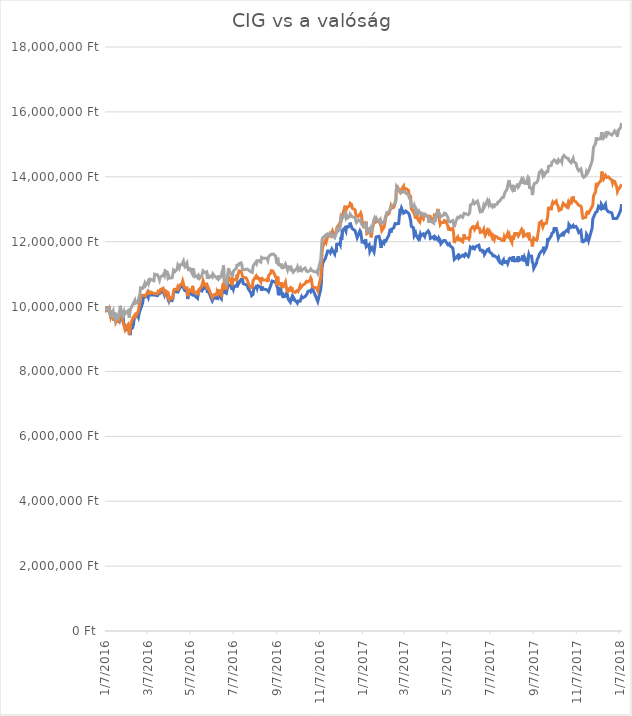
| Category | Series 0 | Valódi | USDHUF nélkül |
|---|---|---|---|
| 1/7/16 | 10000000 | 10000000 | 10000000 |
| 1/8/16 | 9874837.663 | 9873043.613 | 9911183.194 |
| 1/11/16 | 9892191.39 | 9892722.848 | 9913500.154 |
| 1/12/16 | 10006181.556 | 10009686.042 | 9947482.237 |
| 1/13/16 | 9769637.783 | 9768966.315 | 9750540.624 |
| 1/14/16 | 9850338.284 | 9852021.037 | 9891102.873 |
| 1/15/16 | 9673398.325 | 9672088.483 | 9742045.103 |
| 1/18/16 | 9693474.205 | 9822749.404 | 9867160.951 |
| 1/19/16 | 9818352.984 | 9561372.497 | 9640871.177 |
| 1/20/16 | 9561506.485 | 9627882.8 | 9701884.461 |
| 1/21/16 | 9626214.336 | 9735030.193 | 9811553.908 |
| 1/22/16 | 9731697.773 | 9513684.858 | 9586808.774 |
| 1/25/16 | 9510295.977 | 9636884.382 | 9722737.102 |
| 1/26/16 | 9631545.219 | 9591272.149 | 9668674.699 |
| 1/27/16 | 9585892.441 | 9601932.793 | 9732004.943 |
| 1/28/16 | 9595760.246 | 9867094.029 | 10022397.281 |
| 1/29/16 | 9857994.34 | 9776549.566 | 9936669.756 |
| 2/1/16 | 9766121.669 | 9516937.094 | 9708063.021 |
| 2/2/16 | 9507573.824 | 9540402.037 | 9749768.304 |
| 2/3/16 | 9530315.146 | 9382196.926 | 9842446.71 |
| 2/4/16 | 9372033.278 | 9289536.564 | 9774482.546 |
| 2/5/16 | 9279309.934 | 9336635.164 | 9791473.587 |
| 2/8/16 | 9324282.174 | 9434668.517 | 9864071.671 |
| 2/9/16 | 9421088.748 | 9277233.151 | 9776027.186 |
| 2/10/16 | 9263827.688 | 9139814.448 | 9660951.498 |
| 2/11/16 | 9117908.933 | 9313711.23 | 9891102.873 |
| 2/12/16 | 9295472.719 | 9469427.881 | 9928946.555 |
| 2/15/16 | 9355530.224 | 9637506.908 | 10060240.964 |
| 2/16/16 | 9455229.086 | 9660022.459 | 10106580.167 |
| 2/17/16 | 9623265.336 | 9709518.634 | 10121254.248 |
| 2/18/16 | 9643114.37 | 9743438.517 | 10193852.332 |
| 2/19/16 | 9692850.378 | 9689673.021 | 10097312.326 |
| 2/22/16 | 9724268.563 | 9814084.294 | 10119709.608 |
| 2/23/16 | 9670846.306 | 9883272.601 | 10218566.574 |
| 2/24/16 | 9792379.105 | 9865342.304 | 10188446.092 |
| 2/25/16 | 9859638.974 | 10136139.818 | 10362218.103 |
| 2/26/16 | 9841377.863 | 10342861.329 | 10576150.757 |
| 2/29/16 | 10105086.457 | 10339699.129 | 10559932.036 |
| 3/1/16 | 10306582.507 | 10323325.732 | 10568427.556 |
| 3/2/16 | 10302839.546 | 10347067.017 | 10655699.722 |
| 3/3/16 | 10286166.358 | 10376073.719 | 10713623.726 |
| 3/4/16 | 10308680.833 | 10322616.699 | 10642570.281 |
| 3/7/16 | 10334427.866 | 10449567.275 | 10745288.848 |
| 3/8/16 | 10282877.089 | 10400963.52 | 10705900.525 |
| 3/9/16 | 10403048.812 | 10431607.895 | 10862681.495 |
| 3/10/16 | 10354617.169 | 10398966.553 | 10790855.731 |
| 3/11/16 | 10383766.893 | 10449577.04 | 10843373.494 |
| 3/16/16 | 10356545.361 | 10407153.544 | 10799351.251 |
| 3/17/16 | 10342310.768 | 10393249.289 | 10997837.504 |
| 3/18/16 | 10349172.862 | 10401007.038 | 10979301.823 |
| 3/21/16 | 10336979.884 | 10390514.79 | 10976984.863 |
| 3/22/16 | 10412122.656 | 10468872.278 | 10980846.463 |
| 3/23/16 | 10402368.273 | 10459462.312 | 10886623.417 |
| 3/24/16 | 10391025.968 | 10448441.66 | 10820976.213 |
| 3/25/16 | 10378492.721 | 10519191.536 | 10912109.978 |
| 3/29/16 | 10499571.828 | 10564606.688 | 10959221.501 |
| 3/30/16 | 10408663.253 | 10470965.675 | 11002471.424 |
| 3/31/16 | 10352405.419 | 10414404.994 | 10957676.861 |
| 4/1/16 | 10428568.998 | 10493937.135 | 11105189.991 |
| 4/4/16 | 10384447.431 | 10450437.751 | 11061167.748 |
| 4/5/16 | 10251855.885 | 10313908.761 | 10905159.098 |
| 4/6/16 | 10287243.877 | 10351183.121 | 10943775.1 |
| 4/7/16 | 10172062.768 | 10232736.902 | 10875038.616 |
| 4/8/16 | 10216751.45 | 10279726.547 | 10894346.617 |
| 4/11/16 | 10185219.842 | 10249184.732 | 10888940.377 |
| 4/12/16 | 10242328.348 | 10308984.806 | 10997837.504 |
| 4/13/16 | 10417680.385 | 10491542.532 | 11124497.992 |
| 4/14/16 | 10455563.684 | 10531541.944 | 11099783.75 |
| 4/15/16 | 10443540.841 | 10519750.563 | 11078931.109 |
| 4/18/16 | 10450346.224 | 10528950.366 | 11150756.874 |
| 4/19/16 | 10523560.803 | 10605876.123 | 11272011.121 |
| 4/20/16 | 10485167.101 | 10567204.555 | 11282823.602 |
| 4/21/16 | 10461064.702 | 10543197.143 | 11187828.236 |
| 4/22/16 | 10582654.213 | 10668681.014 | 11284368.242 |
| 4/25/16 | 10617191.532 | 10706375.726 | 11289774.483 |
| 4/26/16 | 10692504.438 | 10784673.668 | 11354649.367 |
| 4/27/16 | 10700444.051 | 10793536.362 | 11399443.93 |
| 4/28/16 | 10529175.244 | 10617697.118 | 11281278.962 |
| 4/29/16 | 10490894.965 | 10579443.035 | 11235712.079 |
| 5/2/16 | 10488456.369 | 10579077.082 | 11344609.206 |
| 5/3/16 | 10232290.408 | 10319647.785 | 11185511.276 |
| 5/4/16 | 10331875.847 | 10421522.279 | 11139944.393 |
| 5/5/16 | 10345429.902 | 10435982.085 | 11112140.871 |
| 5/6/16 | 10421706.903 | 10514216.713 | 11169292.555 |
| 5/9/16 | 10373445.395 | 10467256.735 | 11037225.826 |
| 5/10/16 | 10542332.318 | 10639183.112 | 11181649.676 |
| 5/11/16 | 10391706.507 | 10487073.875 | 11034136.546 |
| 5/12/16 | 10415695.482 | 10512145.791 | 11068118.628 |
| 5/13/16 | 10332896.655 | 10428699.854 | 10920605.499 |
| 5/17/16 | 10254634.749 | 10463394.418 | 10955359.901 |
| 5/18/16 | 10418417.635 | 10352011.086 | 10838739.574 |
| 5/19/16 | 10418304.212 | 10519078.335 | 10926011.739 |
| 5/20/16 | 10512615.479 | 10519699.137 | 10873493.976 |
| 5/23/16 | 10482558.37 | 10616224.734 | 10953815.261 |
| 5/24/16 | 10687910.804 | 10587774.061 | 10926784.059 |
| 5/25/16 | 10683714.151 | 10797368.481 | 11099011.43 |
| 5/26/16 | 10553277.643 | 10793817.003 | 11127587.272 |
| 5/27/16 | 10578570.983 | 10661233.599 | 11048038.307 |
| 5/30/16 | 10621444.896 | 10687776.279 | 11071207.909 |
| 5/31/16 | 10418474.347 | 10524141.151 | 10854185.975 |
| 6/1/16 | 10488342.946 | 10597305.082 | 10966172.382 |
| 6/2/16 | 10439174.053 | 10547056.78 | 10975440.222 |
| 6/3/16 | 10393294.429 | 10500158.869 | 10900525.178 |
| 6/6/16 | 10225938.718 | 10328713.848 | 10953042.941 |
| 6/7/16 | 10176316.133 | 10277840.181 | 10921377.819 |
| 6/8/16 | 10225598.448 | 10329742.476 | 11007877.665 |
| 6/9/16 | 10245390.771 | 10351025.712 | 10984708.063 |
| 6/10/16 | 10266147.189 | 10373246.08 | 10948409.021 |
| 6/13/16 | 10253160.25 | 10361861.968 | 10885078.777 |
| 6/14/16 | 10358246.706 | 10470817.766 | 10912882.298 |
| 6/15/16 | 10311743.256 | 10423482.945 | 10847235.094 |
| 6/16/16 | 10419041.462 | 10535136.436 | 10966172.382 |
| 6/17/16 | 10319682.869 | 10433433.468 | 10868860.056 |
| 6/20/16 | 10237507.869 | 10350871.274 | 10941458.14 |
| 6/21/16 | 10405941.099 | 10525236.41 | 11085109.669 |
| 6/22/16 | 10538475.934 | 10662631.338 | 11116774.791 |
| 6/23/16 | 10607777.419 | 10734725.298 | 11274328.082 |
| 6/24/16 | 10447056.955 | 10569870.061 | 10790083.411 |
| 6/27/16 | 10407982.714 | 10553300.379 | 10696632.685 |
| 6/28/16 | 10507965.134 | 10682975.37 | 10834105.653 |
| 6/29/16 | 10601992.843 | 10807260.705 | 10976212.542 |
| 6/30/16 | 10675944.672 | 10922696.269 | 11182421.996 |
| 7/1/16 | 10641861.045 | 10882620.992 | 11118319.432 |
| 7/4/16 | 10647872.467 | 10746558.234 | 10984708.063 |
| 7/5/16 | 10518967.17 | 10831623.323 | 11006333.024 |
| 7/6/16 | 10605508.958 | 10754764.595 | 10959993.821 |
| 7/7/16 | 10534335.993 | 10839746.204 | 11094377.51 |
| 7/8/16 | 10617134.82 | 10867749.539 | 11116002.471 |
| 7/11/16 | 10647135.217 | 10823813.139 | 11173154.155 |
| 7/12/16 | 10592181.749 | 10986236.198 | 11270466.481 |
| 7/13/16 | 10740198.831 | 10918974.3 | 11255020.08 |
| 7/14/16 | 10685812.478 | 10943154.007 | 11273555.762 |
| 7/15/16 | 10697721.898 | 11093147.025 | 11319894.964 |
| 7/18/16 | 10839160.443 | 11091176.86 | 11346926.166 |
| 7/19/16 | 10832071.502 | 11088472.559 | 11289002.162 |
| 7/20/16 | 10839160.443 | 10938532.85 | 11148439.914 |
| 7/21/16 | 10707589.703 | 10912583.772 | 11167747.915 |
| 7/22/16 | 10690973.226 | 10890873.26 | 11132221.192 |
| 7/25/16 | 10671124.193 | 10886834.004 | 11147667.593 |
| 7/26/16 | 10651161.736 | 10905364.431 | 11136082.793 |
| 7/27/16 | 10648836.563 | 10801659.773 | 11153846.154 |
| 7/28/16 | 10551179.316 | 10775510.404 | 11142261.353 |
| 7/29/16 | 10525488.995 | 10671820.686 | 11116002.471 |
| 8/1/16 | 10420799.519 | 10582878.313 | 11068118.628 |
| 8/2/16 | 10336242.635 | 10590120.396 | 11092832.87 |
| 8/3/16 | 10345543.325 | 10608344.496 | 11053444.547 |
| 8/4/16 | 10373785.664 | 10793167.782 | 11248841.52 |
| 8/5/16 | 10551009.182 | 10832076.313 | 11241890.639 |
| 8/8/16 | 10589176.038 | 10932949.67 | 11370095.768 |
| 8/9/16 | 10664262.098 | 10838316.755 | 11329162.805 |
| 8/10/16 | 10571708.888 | 10915504.87 | 11410256.41 |
| 8/11/16 | 10639876.142 | 10899131.791 | 11408711.77 |
| 8/12/16 | 10622352.281 | 10871795.084 | 11413345.69 |
| 8/15/16 | 10595811.287 | 10756661.469 | 11371640.408 |
| 8/16/16 | 10485564.081 | 10908489.322 | 11513747.297 |
| 8/17/16 | 10612938.167 | 10824367.92 | 11492894.656 |
| 8/18/16 | 10539950.434 | 10831450.364 | 11488260.735 |
| 8/19/16 | 10543239.703 | 10817089.934 | 11465091.134 |
| 8/22/16 | 10527757.456 | 10820668.797 | 11489805.375 |
| 8/23/16 | 10524751.745 | 10802754.607 | 11462001.854 |
| 8/24/16 | 10509609.768 | 10825412.681 | 11479765.215 |
| 8/25/16 | 10523560.803 | 10756154.93 | 11423385.851 |
| 8/26/16 | 10458739.53 | 10953111.934 | 11530738.338 |
| 8/29/16 | 10644923.468 | 11027717.944 | 11602564.103 |
| 8/30/16 | 10706398.761 | 11105505.632 | 11622644.424 |
| 8/31/16 | 10786078.455 | 11097169.06 | 11611831.943 |
| 9/1/16 | 10775530.111 | 11096882.13 | 11640407.785 |
| 9/2/16 | 10775643.534 | 11078724.051 | 11618010.504 |
| 9/5/16 | 10749499.521 | 10924038.575 | 11552363.299 |
| 9/6/16 | 10759934.441 | 10877437.412 | 11567809.7 |
| 9/7/16 | 10622352.281 | 10656119.861 | 11323756.565 |
| 9/8/16 | 10570177.677 | 10922181.982 | 11505251.776 |
| 9/9/16 | 10349683.266 | 10707321.562 | 11293636.083 |
| 9/12/16 | 10599327.401 | 10675531.961 | 11258881.681 |
| 9/13/16 | 10399022.293 | 10748147.347 | 11326845.845 |
| 9/14/16 | 10359891.341 | 10606446.348 | 11199413.037 |
| 9/15/16 | 10430894.171 | 10623269.206 | 11217176.398 |
| 9/16/16 | 10305051.296 | 10611784.683 | 11192462.156 |
| 9/19/16 | 10314408.697 | 10757197.224 | 11311399.444 |
| 9/20/16 | 10311573.121 | 10632470.415 | 11316805.684 |
| 9/21/16 | 10433729.747 | 10517988.065 | 11198640.717 |
| 9/22/16 | 10323822.811 | 10434021.206 | 11135310.473 |
| 9/23/16 | 10226449.121 | 10526838.5 | 11224899.598 |
| 9/26/16 | 10136447.93 | 10578777.202 | 11220265.678 |
| 9/27/16 | 10226902.813 | 10462575.82 | 11089743.59 |
| 9/28/16 | 10279417.686 | 10594167.799 | 11157707.754 |
| 9/29/16 | 10169794.307 | 10472292.405 | 11102873.031 |
| 9/30/16 | 10296714.701 | 10468064.374 | 11057306.148 |
| 10/3/16 | 10176996.671 | 10437205.325 | 11132993.513 |
| 10/4/16 | 10170758.403 | 10408914.741 | 11111368.551 |
| 10/5/16 | 10140814.718 | 10486237.843 | 11161569.354 |
| 10/6/16 | 10106844.514 | 10485104.028 | 11214087.118 |
| 10/7/16 | 10168149.673 | 10460158.396 | 11117547.112 |
| 10/10/16 | 10166788.596 | 10645275.431 | 11191689.836 |
| 10/11/16 | 10139793.91 | 10588773.606 | 11061167.748 |
| 10/12/16 | 10301365.046 | 10604274.192 | 11135310.473 |
| 10/13/16 | 10261156.575 | 10646155.247 | 11105962.311 |
| 10/14/16 | 10269379.746 | 10660197.912 | 11144578.313 |
| 10/17/16 | 10310155.333 | 10710793.54 | 11187828.236 |
| 10/18/16 | 10320873.811 | 10730212.592 | 11159252.394 |
| 10/19/16 | 10366186.32 | 10780720.705 | 11090515.91 |
| 10/20/16 | 10404466.6 | 10797606.214 | 11108279.271 |
| 10/21/16 | 10466112.028 | 10760737.504 | 11076614.149 |
| 10/24/16 | 10491575.503 | 10810447.584 | 11116774.791 |
| 10/25/16 | 10459136.51 | 10878648.526 | 11156163.114 |
| 10/26/16 | 10503144.654 | 10833295.255 | 11121408.712 |
| 10/27/16 | 10560480.006 | 10654454.271 | 11144578.313 |
| 10/28/16 | 10521802.746 | 10604984.525 | 11092832.87 |
| 11/2/16 | 10265012.959 | 10572496.931 | 11058850.788 |
| 11/3/16 | 10259908.921 | 10581709.922 | 11093605.19 |
| 11/4/16 | 10155616.426 | 10484980.239 | 11040315.107 |
| 11/7/16 | 10429022.69 | 10789469.163 | 11346153.846 |
| 11/8/16 | 10507398.018 | 10866256.033 | 11414118.011 |
| 11/9/16 | 10689555.438 | 11093553.711 | 11683657.708 |
| 11/10/16 | 11171773.54 | 11651134.821 | 12052826.691 |
| 11/11/16 | 11341227.578 | 11839427.165 | 12119246.216 |
| 11/15/16 | 11494518.831 | 12050992.494 | 12197250.541 |
| 11/16/16 | 11574141.813 | 11992565.879 | 12160951.498 |
| 11/17/16 | 11625465.743 | 12079917.413 | 12131603.336 |
| 11/18/16 | 11710816.589 | 12143674.058 | 12232777.263 |
| 11/21/16 | 11706960.206 | 12247394.558 | 12183348.78 |
| 11/22/16 | 11662044.677 | 12246962.823 | 12257491.504 |
| 11/23/16 | 11670948.387 | 12186267.568 | 12253629.904 |
| 11/24/16 | 11771668.056 | 12214508.743 | 12211152.302 |
| 11/25/16 | 11732253.546 | 12328629.359 | 12216558.542 |
| 11/28/16 | 11616959.015 | 12172258.365 | 12123107.816 |
| 11/29/16 | 11747168.677 | 12192587.033 | 12177942.539 |
| 11/30/16 | 11676506.116 | 12267193.389 | 12159406.858 |
| 12/1/16 | 11920138.83 | 12422473.954 | 12366388.631 |
| 12/2/16 | 11895015.624 | 12457196.46 | 12310009.268 |
| 12/5/16 | 11938910.345 | 12550617.731 | 12373339.512 |
| 12/6/16 | 11896036.431 | 12627152.751 | 12460611.677 |
| 12/7/16 | 12147268.489 | 12754300.142 | 12719338.894 |
| 12/8/16 | 12051652.857 | 12703285.782 | 12674544.331 |
| 12/9/16 | 12339010.157 | 12699220.866 | 12732468.335 |
| 12/12/16 | 12414776.755 | 13042691.984 | 12829780.661 |
| 12/13/16 | 12435873.443 | 13108919.178 | 12868396.664 |
| 12/14/16 | 12322733.949 | 12963847.461 | 12747914.736 |
| 12/15/16 | 12494796.718 | 13016029.628 | 12799660.179 |
| 12/16/16 | 12438822.442 | 13061390.17 | 12724745.134 |
| 12/19/16 | 12471488.281 | 13100703.529 | 12770312.017 |
| 12/20/16 | 12584060.659 | 13183816.099 | 12848316.342 |
| 12/21/16 | 12507556.811 | 13198002.189 | 12816651.22 |
| 12/22/16 | 12454247.977 | 13150174.31 | 12822829.781 |
| 12/23/16 | 12401165.989 | 13029452.712 | 12767995.057 |
| 12/27/16 | 12340541.368 | 12982345.78 | 12739419.215 |
| 12/28/16 | 12264718.059 | 12847924.145 | 12646740.809 |
| 12/29/16 | 12202732.361 | 12804250.979 | 12592678.406 |
| 12/30/16 | 12121408.034 | 12778427.441 | 12587272.166 |
| 12/31/16 | 12120614.072 | 12767689.022 | 12652919.37 |
| 1/3/17 | 12336344.715 | 12846821.536 | 12672227.371 |
| 1/4/17 | 12295625.84 | 12886282.487 | 12611986.407 |
| 1/5/17 | 12154357.43 | 12829486.301 | 12620481.928 |
| 1/6/17 | 11988929.91 | 12637379.378 | 12513129.441 |
| 1/9/17 | 12007134.31 | 12414950.593 | 12470651.838 |
| 1/10/17 | 11919571.715 | 12600378.653 | 12529348.162 |
| 1/11/17 | 12069460.276 | 12476297.403 | 12466017.918 |
| 1/12/17 | 11843238.001 | 12612553.474 | 12503861.6 |
| 1/13/17 | 11855827.96 | 12249677.632 | 12329317.269 |
| 1/16/17 | 11913673.716 | 12295736.618 | 12394964.473 |
| 1/17/17 | 11696468.573 | 12276444.512 | 12311553.908 |
| 1/18/17 | 11743652.563 | 12251327.884 | 12373339.512 |
| 1/19/17 | 11720684.395 | 12132891.138 | 12265214.705 |
| 1/20/17 | 11814938.95 | 12324872.76 | 12412727.834 |
| 1/23/17 | 11678547.731 | 12627824.872 | 12685356.812 |
| 1/24/17 | 11818341.642 | 12633384.913 | 12737102.255 |
| 1/25/17 | 12038722.63 | 12600094.987 | 12696941.613 |
| 1/26/17 | 12145226.874 | 12618070.235 | 12727834.415 |
| 1/27/17 | 12171654.445 | 12620674.55 | 12676861.291 |
| 1/30/17 | 12164792.351 | 12658504.115 | 12635928.329 |
| 1/31/17 | 12095887.847 | 12592709.585 | 12588816.806 |
| 2/1/17 | 11953258.361 | 12634878.34 | 12661414.89 |
| 2/2/17 | 11810515.451 | 12486390.476 | 12621254.248 |
| 2/3/17 | 11996585.966 | 12336541.387 | 12583410.565 |
| 2/6/17 | 11940838.537 | 12439180.532 | 12578776.645 |
| 2/7/17 | 12035206.515 | 12521574.517 | 12669138.091 |
| 2/8/17 | 12025962.536 | 12645495.783 | 12666821.131 |
| 2/9/17 | 12021822.595 | 12787363.427 | 12808928.02 |
| 2/10/17 | 12076265.659 | 12780471.986 | 12893883.225 |
| 2/13/17 | 12196891.074 | 12863883.746 | 12919369.787 |
| 2/14/17 | 12295285.571 | 12907269.85 | 12954896.509 |
| 2/15/17 | 12397479.74 | 12993055.01 | 13018999.073 |
| 2/16/17 | 12286438.573 | 13094440.214 | 13046030.275 |
| 2/17/17 | 12386420.992 | 13031809.688 | 13099320.358 |
| 2/20/17 | 12423170.061 | 13059754.91 | 13141025.641 |
| 2/21/17 | 12504834.658 | 13106683.178 | 13146431.881 |
| 2/22/17 | 12559107.587 | 13212508.114 | 13178097.003 |
| 2/23/17 | 12573512.315 | 13297789.044 | 13239110.287 |
| 2/24/17 | 12547198.167 | 13735909.69 | 13691689.836 |
| 2/27/17 | 12560525.376 | 13595072.266 | 13584337.349 |
| 2/28/17 | 12581281.794 | 13563923.024 | 13568118.628 |
| 3/1/17 | 13011155.157 | 13524152.774 | 13546493.667 |
| 3/2/17 | 12944348.98 | 13579240.249 | 13538770.466 |
| 3/3/17 | 13034860.575 | 13593606.809 | 13513283.905 |
| 3/6/17 | 12876351.861 | 13710774.036 | 13544176.707 |
| 3/7/17 | 12888658.262 | 13560488.303 | 13514056.225 |
| 3/8/17 | 12906238.835 | 13638337.686 | 13545721.347 |
| 3/9/17 | 12942023.807 | 13617153.774 | 13494748.224 |
| 3/10/17 | 12914802.275 | 13630554.25 | 13490114.303 |
| 3/13/17 | 12878847.168 | 13575274.337 | 13444547.42 |
| 3/14/17 | 12834668.89 | 13431156.895 | 13347235.094 |
| 3/16/17 | 12660904.776 | 13397981.63 | 13289311.091 |
| 3/17/17 | 12473416.472 | 13014757.138 | 13088507.878 |
| 3/20/17 | 12427877.117 | 12906460.99 | 13075378.437 |
| 3/21/17 | 12189178.307 | 12941972.109 | 13120945.32 |
| 3/22/17 | 12202959.207 | 12798594.428 | 13025949.954 |
| 3/23/17 | 12274982.845 | 12712236.336 | 12931726.908 |
| 3/24/17 | 12185548.769 | 12810891.101 | 12998918.752 |
| 3/27/17 | 12081993.524 | 12659638.912 | 12866079.703 |
| 3/28/17 | 12147892.316 | 12673299.199 | 12925548.347 |
| 3/29/17 | 12113184.863 | 12604114.501 | 12873030.584 |
| 3/30/17 | 12231882.085 | 12718997.725 | 12887704.665 |
| 3/31/17 | 12179480.636 | 12788636.554 | 12886932.345 |
| 4/3/17 | 12235511.623 | 12701333.581 | 12807383.38 |
| 4/4/17 | 12219518.973 | 12798060.584 | 12856811.863 |
| 4/5/17 | 12161389.659 | 12782933.831 | 12833642.261 |
| 4/6/17 | 12239027.738 | 12807374.756 | 12847544.022 |
| 4/7/17 | 12258536.502 | 12802619.567 | 12797343.219 |
| 4/10/17 | 12330730.274 | 12787264.874 | 12751776.336 |
| 4/11/17 | 12320522.2 | 12681379.251 | 12581093.605 |
| 4/12/17 | 12251277.427 | 12817372.327 | 12693080.012 |
| 4/13/17 | 12100878.462 | 12742010.156 | 12642106.889 |
| 4/18/17 | 12157760.122 | 12673071.948 | 12570281.124 |
| 4/19/17 | 12044677.34 | 12861689.301 | 12741736.175 |
| 4/20/17 | 12142844.99 | 12669914.497 | 12620481.928 |
| 4/21/17 | 12112901.305 | 12787245.184 | 12803521.779 |
| 4/24/17 | 12045981.705 | 13007583.305 | 12938677.788 |
| 4/25/17 | 12118685.881 | 12772477.512 | 12946400.989 |
| 4/26/17 | 12118402.323 | 12648202.128 | 12862990.423 |
| 4/27/17 | 12049044.127 | 12537671.44 | 12759499.537 |
| 4/28/17 | 11932104.962 | 12583222.348 | 12777262.898 |
| 5/2/17 | 12037248.13 | 12593046.588 | 12824374.421 |
| 5/3/17 | 12059195.49 | 12652580.748 | 12876892.184 |
| 5/4/17 | 12037531.688 | 12626516.108 | 12846771.702 |
| 5/5/17 | 12009856.463 | 12638479.201 | 12862990.423 |
| 5/8/17 | 11905450.545 | 12472894.976 | 12744825.456 |
| 5/9/17 | 11900630.065 | 12348043.689 | 12624343.528 |
| 5/10/17 | 11934770.403 | 12420686.406 | 12644423.849 |
| 5/11/17 | 11874315.917 | 12402577.126 | 12609669.447 |
| 5/12/17 | 11863880.997 | 12372571.65 | 12613531.047 |
| 5/15/17 | 11800590.934 | 12412846.714 | 12650602.41 |
| 5/16/17 | 11643613.432 | 12281227.987 | 12635928.329 |
| 5/17/17 | 11450170.418 | 11963187.997 | 12454433.117 |
| 5/18/17 | 11431852.595 | 11992468.068 | 12482236.639 |
| 5/19/17 | 11489074.525 | 12066758.915 | 12607352.487 |
| 5/22/17 | 11569718.314 | 12150380.943 | 12753320.976 |
| 5/23/17 | 11511475.577 | 12131783.885 | 12780352.178 |
| 5/24/17 | 11558376.009 | 12015310.379 | 12737874.575 |
| 5/25/17 | 11514821.557 | 12118587.601 | 12766450.417 |
| 5/26/17 | 11520776.267 | 12048253.989 | 12796570.899 |
| 5/29/17 | 11585143.849 | 11995563.797 | 12751776.336 |
| 5/30/17 | 11576693.831 | 12077649.039 | 12764905.777 |
| 5/31/17 | 11544254.839 | 12228906.694 | 12871485.944 |
| 6/1/17 | 11589283.79 | 12153218.692 | 12842910.102 |
| 6/2/17 | 11625749.301 | 12105956.738 | 12860673.463 |
| 6/6/17 | 11540852.147 | 12110666.604 | 12830552.981 |
| 6/7/17 | 11593707.289 | 12077109.994 | 12859128.823 |
| 6/8/17 | 11615768.073 | 12135161.661 | 12893110.905 |
| 6/9/17 | 11835865.503 | 12362560.599 | 13129440.84 |
| 6/12/17 | 11792991.59 | 12459999.5 | 13168056.843 |
| 6/13/17 | 11835014.83 | 12469460.388 | 13242971.888 |
| 6/14/17 | 11810061.759 | 12459816.802 | 13241427.247 |
| 6/15/17 | 11788171.11 | 12375855.755 | 13171918.443 |
| 6/16/17 | 11835014.83 | 12411490.424 | 13166512.203 |
| 6/19/17 | 11875393.436 | 12539008.73 | 13249150.448 |
| 6/20/17 | 11866489.727 | 12424732.827 | 13171918.443 |
| 6/21/17 | 11892009.913 | 12426296.467 | 13100092.678 |
| 6/22/17 | 11790439.571 | 12405649.185 | 12999691.072 |
| 6/23/17 | 11737074.026 | 12284196.795 | 12914735.867 |
| 6/26/17 | 11733841.469 | 12302253.561 | 12935588.508 |
| 6/27/17 | 11644464.104 | 12278204.17 | 12924776.027 |
| 6/28/17 | 11726525.682 | 12388823.169 | 13120945.32 |
| 6/29/17 | 11606013.69 | 12254601.374 | 13075378.437 |
| 6/30/17 | 11593026.751 | 12196747.451 | 13080784.677 |
| 7/3/17 | 11754314.329 | 12348487.683 | 13268458.449 |
| 7/4/17 | 11757036.483 | 12376706.355 | 13272320.049 |
| 7/5/17 | 11776942.228 | 12261485.783 | 13144887.241 |
| 7/6/17 | 11692782.324 | 12334200.359 | 13217485.326 |
| 7/7/17 | 11665787.638 | 12297163.493 | 13148748.842 |
| 7/10/17 | 11617185.861 | 12122716.972 | 13070744.517 |
| 7/11/17 | 11563083.065 | 12181796.152 | 13123262.28 |
| 7/12/17 | 11533706.495 | 12177915.075 | 13105498.919 |
| 7/13/17 | 11566826.026 | 12073535.801 | 13088507.878 |
| 7/14/17 | 11536825.629 | 12170555.652 | 13141797.961 |
| 7/17/17 | 11503989.656 | 12144226.132 | 13153382.762 |
| 7/18/17 | 11460151.647 | 12144542.649 | 13222119.246 |
| 7/19/17 | 11507732.616 | 12096480.513 | 13232159.407 |
| 7/20/17 | 11514594.711 | 12083092.031 | 13232931.727 |
| 7/21/17 | 11349223.903 | 12098395.166 | 13235248.687 |
| 7/24/17 | 11316047.66 | 12034390.413 | 13356502.935 |
| 7/25/17 | 11410472.35 | 12022510.827 | 13362681.495 |
| 7/26/17 | 11442968.054 | 12032861.004 | 13364998.455 |
| 7/27/17 | 11324100.697 | 12146475.506 | 13438368.86 |
| 7/28/17 | 11390963.586 | 12085579.112 | 13513283.905 |
| 7/31/17 | 11386937.067 | 12203418.964 | 13615230.151 |
| 8/1/17 | 11326255.735 | 12260910.49 | 13735712.079 |
| 8/2/17 | 11389035.394 | 12185614.102 | 13823756.565 |
| 8/3/17 | 11455671.436 | 12222192.325 | 13895582.329 |
| 8/4/17 | 11489868.486 | 12106765.014 | 13750386.16 |
| 8/7/17 | 11477278.527 | 11974344.353 | 13626042.632 |
| 8/8/17 | 11382967.26 | 12183251.527 | 13751930.8 |
| 8/9/17 | 11549075.319 | 12062721.994 | 13620636.392 |
| 8/10/17 | 11454310.359 | 12090663.713 | 13541859.747 |
| 8/11/17 | 11406389.12 | 12252883.589 | 13692462.156 |
| 8/14/17 | 11416313.637 | 12254492.419 | 13706363.917 |
| 8/15/17 | 11479206.719 | 12211356.493 | 13789002.162 |
| 8/16/17 | 11546353.165 | 12171502.762 | 13682421.996 |
| 8/17/17 | 11418865.656 | 12209820.981 | 13713314.798 |
| 8/18/17 | 11424139.828 | 12262510.802 | 13773555.762 |
| 8/21/17 | 11469282.202 | 12385566.21 | 13936515.292 |
| 8/22/17 | 11574368.659 | 12347098.117 | 13900216.25 |
| 8/23/17 | 11488337.275 | 12220404.619 | 13780506.642 |
| 8/24/17 | 11389375.663 | 12264316.075 | 13870868.088 |
| 8/25/17 | 11511135.308 | 12182467.664 | 13801359.283 |
| 8/28/17 | 11342702.077 | 12223937.84 | 13795180.723 |
| 8/29/17 | 11248901.214 | 12198760.021 | 13928792.091 |
| 8/30/17 | 11500303.407 | 12151154.59 | 13991350.015 |
| 8/31/17 | 11608735.843 | 12279134.961 | 13958140.253 |
| 9/1/17 | 11547260.55 | 12084934.932 | 13668520.235 |
| 9/4/17 | 11553101.837 | 12035369.286 | 13653846.154 |
| 9/5/17 | 11371341.398 | 11853063.596 | 13437596.54 |
| 9/6/17 | 11340376.905 | 11998311.059 | 13554216.867 |
| 9/7/17 | 11174495.693 | 12110780.627 | 13737256.719 |
| 9/8/17 | 11149542.622 | 12128398.918 | 13795953.043 |
| 9/11/17 | 11335443.002 | 12042688.747 | 13818350.324 |
| 9/12/17 | 11456181.84 | 12079783.487 | 13791319.123 |
| 9/13/17 | 11462420.108 | 12244499.226 | 13893265.369 |
| 9/14/17 | 11537619.59 | 12366972.257 | 14015291.937 |
| 9/15/17 | 11616618.745 | 12578274.219 | 14134229.225 |
| 9/18/17 | 11707470.609 | 12628579.944 | 14196787.149 |
| 9/19/17 | 11729020.989 | 12600734.39 | 14145814.025 |
| 9/20/17 | 11727830.047 | 12453872.472 | 14045412.419 |
| 9/21/17 | 11842047.059 | 12440950.195 | 14096385.542 |
| 9/22/17 | 11693179.305 | 12560039.479 | 14045412.419 |
| 9/25/17 | 11813974.854 | 12567451.204 | 14154309.546 |
| 9/26/17 | 11904202.891 | 12668833.435 | 14149675.626 |
| 9/27/17 | 12109158.344 | 12802430.793 | 14158171.146 |
| 9/28/17 | 12044053.513 | 13073356.473 | 14319586.036 |
| 9/29/17 | 12028287.709 | 13024683.726 | 14339666.358 |
| 10/2/17 | 12186909.846 | 13005827.839 | 14352023.479 |
| 10/3/17 | 12260294.56 | 13153213.597 | 14451652.765 |
| 10/4/17 | 12232732.758 | 13212306.231 | 14475594.686 |
| 10/5/17 | 12292733.552 | 13170969.13 | 14481000.927 |
| 10/6/17 | 12406950.565 | 13189628.998 | 14519616.929 |
| 10/9/17 | 12405022.373 | 13252226.221 | 14477911.647 |
| 10/10/17 | 12323471.199 | 13158357.002 | 14388322.521 |
| 10/11/17 | 12228082.413 | 13125044.573 | 14470960.766 |
| 10/12/17 | 12106322.768 | 13069613.143 | 14516527.649 |
| 10/13/17 | 12156115.487 | 12962849.8 | 14472505.406 |
| 10/16/17 | 12205851.495 | 12991181.355 | 14508032.129 |
| 10/17/17 | 12202732.361 | 12980204.592 | 14458603.645 |
| 10/18/17 | 12253205.619 | 13125647.941 | 14599938.214 |
| 10/19/17 | 12166040.004 | 13183118.424 | 14626969.416 |
| 10/20/17 | 12260634.829 | 13157388.344 | 14657089.898 |
| 10/24/17 | 12351826.962 | 13067181.442 | 14574451.653 |
| 10/25/17 | 12337932.638 | 13122818.073 | 14566728.452 |
| 10/26/17 | 12315985.278 | 13197492.785 | 14565183.812 |
| 10/27/17 | 12533530.689 | 13111313.145 | 14508032.129 |
| 10/30/17 | 12439786.538 | 13275984.543 | 14437751.004 |
| 10/31/17 | 12444096.614 | 13235201.745 | 14455514.365 |
| 11/2/17 | 12501715.524 | 13397085.972 | 14566728.452 |
| 11/3/17 | 12447045.613 | 13262647.222 | 14463237.566 |
| 11/6/17 | 12470467.473 | 13229284.084 | 14417670.683 |
| 11/7/17 | 12484758.778 | 13251790.878 | 14388322.521 |
| 11/8/17 | 12400995.854 | 13173974.027 | 14257028.112 |
| 11/9/17 | 12394644.164 | 13168571.661 | 14248532.592 |
| 11/10/17 | 12284567.093 | 13120503.422 | 14185974.668 |
| 11/13/17 | 12341392.041 | 13098047.045 | 14241581.711 |
| 11/14/17 | 12178346.405 | 13038809.235 | 14159715.786 |
| 11/15/17 | 11974411.76 | 12829649.92 | 14041550.819 |
| 11/16/17 | 12076095.525 | 12724366.205 | 14060086.5 |
| 11/17/17 | 12005603.099 | 12729640.696 | 13983626.815 |
| 11/20/17 | 12045811.57 | 12754292.287 | 14027649.058 |
| 11/21/17 | 12230124.028 | 12871884.722 | 14147358.665 |
| 11/22/17 | 12193715.229 | 12911156.261 | 14099474.822 |
| 11/23/17 | 12101785.846 | 12897495.603 | 14084028.421 |
| 11/24/17 | 12027153.478 | 12880034.854 | 14171300.587 |
| 11/29/17 | 12411090.506 | 13083704.368 | 14484090.207 |
| 11/30/17 | 12702928.016 | 13129495.769 | 14662496.138 |
| 12/1/17 | 12746709.314 | 13409492.29 | 14906549.274 |
| 12/4/17 | 12904707.624 | 13542993.403 | 15026258.882 |
| 12/5/17 | 12882193.148 | 13811969.35 | 15211615.694 |
| 12/6/17 | 12925407.331 | 13710536.091 | 15142879.209 |
| 12/7/17 | 13001457.486 | 13746910.255 | 15138245.289 |
| 12/8/17 | 13084653.294 | 13795062.427 | 15163731.85 |
| 12/11/17 | 13018867.925 | 13864640.489 | 15171455.051 |
| 12/12/17 | 13157130.624 | 13926835.485 | 15191535.372 |
| 12/13/17 | 13116241.614 | 14160139.614 | 15374575.224 |
| 12/14/17 | 12981551.741 | 13955444.629 | 15245597.776 |
| 12/15/17 | 13055616.993 | 13915131.938 | 15188446.092 |
| 12/18/17 | 13158661.835 | 14046862.327 | 15274945.938 |
| 12/19/17 | 13008659.85 | 14060857.705 | 15395427.865 |
| 12/20/17 | 12975880.588 | 13978895.721 | 15284986.098 |
| 12/21/17 | 12977014.819 | 13977767.691 | 15275718.258 |
| 12/22/17 | 12921153.966 | 13997449.977 | 15360673.463 |
| 12/27/17 | 12890416.319 | 13896096.272 | 15285758.418 |
| 12/28/17 | 12860302.499 | 13805989.436 | 15258727.217 |
| 12/29/17 | 12713362.937 | 13876872.574 | 15345227.062 |
| 12/31/17 | 12711661.591 | 13856084.972 | 15412418.906 |
| 1/3/18 | 12711888.437 | 13684146.07 | 15308928.02 |
| 1/4/18 | 12719714.628 | 13544983.895 | 15231696.015 |
| 1/5/18 | 12783741.94 | 13596373.628 | 15430182.268 |
| 1/8/18 | 12936579.501 | 13688509.167 | 15499691.072 |
| 1/9/18 | 13005200.447 | 13694473.001 | 15556070.436 |
| 1/10/18 | 13159058.816 | 13770231.747 | 15658016.682 |